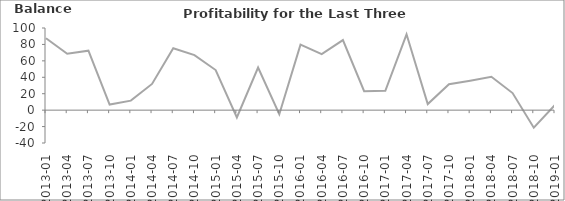
| Category | Balance |
|---|---|
| 2013-01 | 87.6 |
| 2013-04 | 68.6 |
| 2013-07 | 72.4 |
| 2013-10 | 6.8 |
| 2014-01 | 11.6 |
| 2014-04 | 31.9 |
| 2014-07 | 75.4 |
| 2014-10 | 67 |
| 2015-01 | 48.8 |
| 2015-04 | -8.9 |
| 2015-07 | 51.9 |
| 2015-10 | -4.9 |
| 2016-01 | 79.8 |
| 2016-04 | 68.3 |
| 2016-07 | 85.3 |
| 2016-10 | 23.1 |
| 2017-01 | 23.6 |
| 2017-04 | 92.3 |
| 2017-07 | 7.4 |
| 2017-10 | 31.5 |
| 2018-01 | 35.9 |
| 2018-04 | 40.6 |
| 2018-07 | 20.8 |
| 2018-10 | -21.4 |
| 2019-01 | 6.4 |